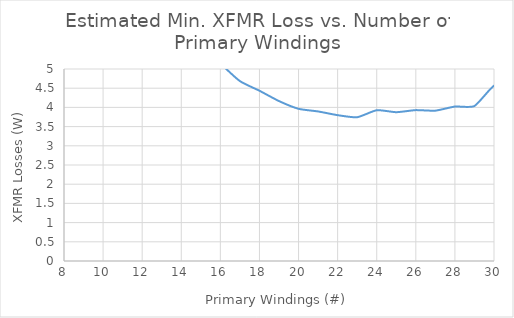
| Category | Losses |
|---|---|
| 8.0 | 21.104 |
| 9.0 | 16.168 |
| 10.0 | 12.8 |
| 11.0 | 10.407 |
| 12.0 | 8.672 |
| 13.0 | 7.398 |
| 14.0 | 6.445 |
| 15.0 | 5.673 |
| 16.0 | 5.148 |
| 17.0 | 4.685 |
| 18.0 | 4.434 |
| 19.0 | 4.165 |
| 20.0 | 3.963 |
| 21.0 | 3.894 |
| 22.0 | 3.798 |
| 23.0 | 3.744 |
| 24.0 | 3.927 |
| 25.0 | 3.875 |
| 26.0 | 3.929 |
| 27.0 | 3.915 |
| 28.0 | 4.022 |
| 29.0 | 4.036 |
| 30.0 | 4.563 |
| 31.0 | 4.612 |
| 32.0 | 4.668 |
| 33.0 | 4.906 |
| 34.0 | 4.979 |
| 35.0 | 5.057 |
| 36.0 | 5.369 |
| 37.0 | 5.461 |
| 38.0 | 6.336 |
| 39.0 | 6.758 |
| 40.0 | 6.888 |
| 41.0 | 7.02 |
| 42.0 | 7.155 |
| 43.0 | 7.291 |
| 44.0 | 7.857 |